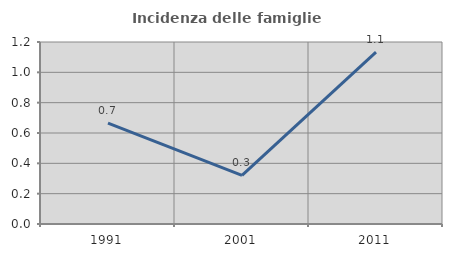
| Category | Incidenza delle famiglie numerose |
|---|---|
| 1991.0 | 0.664 |
| 2001.0 | 0.321 |
| 2011.0 | 1.133 |